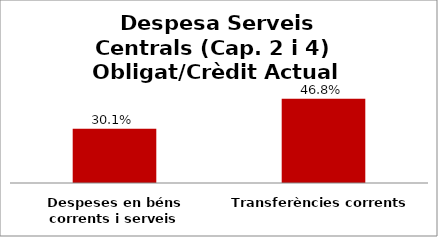
| Category | Series 0 |
|---|---|
| Despeses en béns corrents i serveis | 0.301 |
| Transferències corrents | 0.468 |